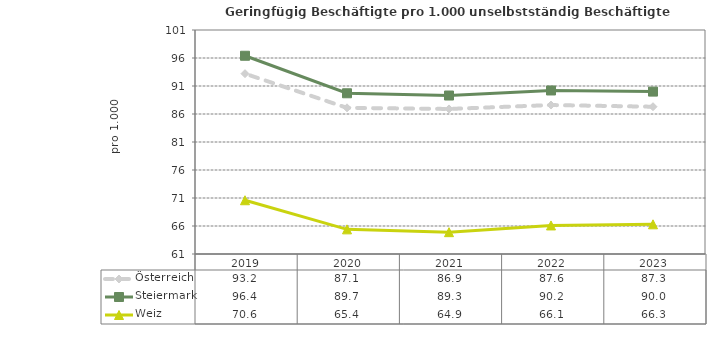
| Category | Österreich | Steiermark | Weiz |
|---|---|---|---|
| 2023.0 | 87.3 | 90 | 66.3 |
| 2022.0 | 87.6 | 90.2 | 66.1 |
| 2021.0 | 86.9 | 89.3 | 64.9 |
| 2020.0 | 87.1 | 89.7 | 65.4 |
| 2019.0 | 93.2 | 96.4 | 70.6 |